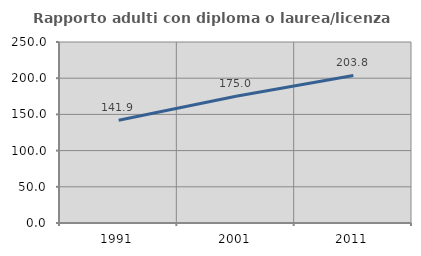
| Category | Rapporto adulti con diploma o laurea/licenza media  |
|---|---|
| 1991.0 | 141.892 |
| 2001.0 | 175 |
| 2011.0 | 203.774 |